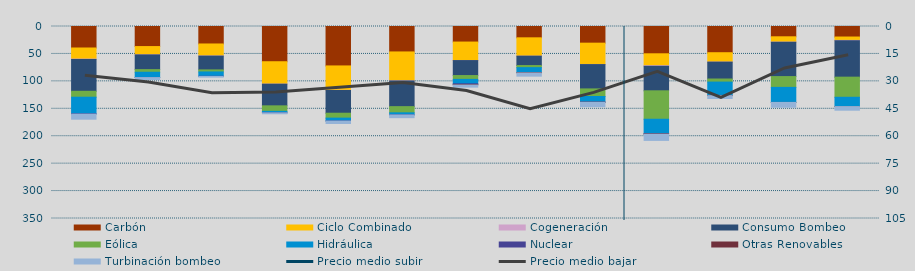
| Category | Carbón | Ciclo Combinado | Cogeneración | Consumo Bombeo | Eólica | Hidráulica | Nuclear | Otras Renovables | Turbinación bombeo |
|---|---|---|---|---|---|---|---|---|---|
| A | 39185.7 | 20218.6 | 667 | 58045.1 | 10784.5 | 30176.3 | 635.3 | 0 | 9263.7 |
| M | 36573.1 | 14965.8 | 259.5 | 26811.1 | 4780.9 | 9611.3 | 138 | 0 | 3683.8 |
| J | 31856.5 | 21784.2 | 332.6 | 25120.8 | 3742.7 | 7869.8 | 320 | 0 | 1244.9 |
| J | 64224.4 | 40730.5 | 223.6 | 39459.7 | 10048.7 | 2606.4 | 130 | 0 | 1680.4 |
| A | 71875.8 | 44407.8 | 356.8 | 41443.4 | 8916.4 | 5181.1 | 179.2 | 0 | 4517 |
| S | 46377.5 | 52485.1 | 420.2 | 46799.1 | 11262.5 | 3698.4 | 178.3 | 0 | 4969.7 |
| O | 28352.7 | 33701.8 | 72.5 | 27285.6 | 6968.9 | 8057.2 | 1524.1 | 736.2 | 3817.1 |
| N | 20637.7 | 33409.3 | 40.8 | 17072.8 | 3847.5 | 8820.4 | 0 | 757.7 | 5932.4 |
| D | 30371.3 | 38818.7 | 239.5 | 44331.3 | 13873.3 | 10280.7 | 108.3 | 133.8 | 8046.3 |
| E | 49749 | 21689 | 1091.7 | 44705.2 | 51833.3 | 26560.6 | 159.6 | 521.7 | 11348.4 |
| F | 47780.9 | 17066.1 | 83.8 | 30784 | 5603.4 | 24359.1 | 40 | 286.6 | 5220.7 |
| M | 18764.1 | 9673.8 | 444.5 | 62414.7 | 19679.2 | 27422.5 | 0 | 20.9 | 8766.8 |
| A | 19179.5 | 6106.3 | 488.3 | 66560.4 | 36687.3 | 16841.6 | 0 | 122 | 6609.5 |